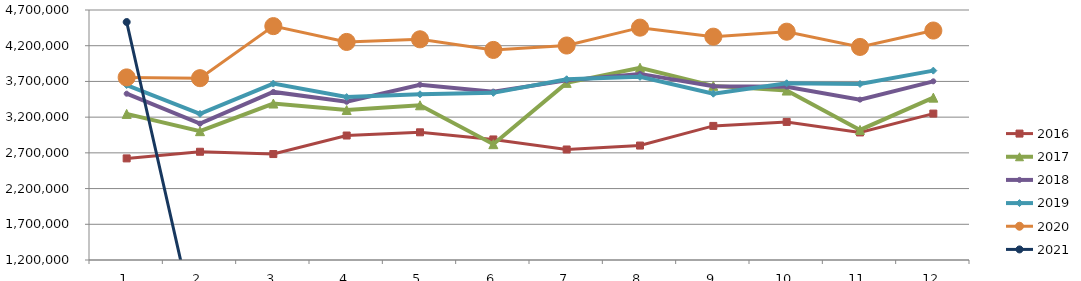
| Category | 2015 | 2016 | 2017 | 2018 | 2019 | 2020 | 2021 |
|---|---|---|---|---|---|---|---|
| 0 |  | 2622357.223 | 3245197.198 | 3528241.229 | 3649683.28 | 3756283.089 | 4531541.153 |
| 1 |  | 2715310.977 | 3003729.629 | 3108555.552 | 3245578.859 | 3745626.569 | 0 |
| 2 |  | 2683334.081 | 3390554.233 | 3553184.371 | 3669368.201 | 4474226.706 | 0 |
| 3 |  | 2942696.513 | 3299613.683 | 3414889.226 | 3480737.518 | 4252877.011 | 0 |
| 4 |  | 2987632.117 | 3365963.719 | 3653293.789 | 3520173.393 | 4289935.067 | 0 |
| 5 |  | 2887718.315 | 2821580.781 | 3557351.211 | 3540194.304 | 4141054.684 | 0 |
| 6 |  | 2747166.698 | 3679918.411 | 3714873.235 | 3730287.221 | 4202654.044 | 0 |
| 7 |  | 2802126.518 | 3891741.582 | 3805404.89 | 3764065.715 | 4452839.823 | 0 |
| 8 |  | 3077154.853 | 3637785.062 | 3633589.924 | 3528193.213 | 4326562.065 | 0 |
| 9 |  | 3132986.26 | 3572314.256 | 3626810.501 | 3674095.651 | 4396335.731 | 0 |
| 10 |  | 2985784.845 | 3021243.296 | 3445044.438 | 3664597.161 | 4182792.836 | 0 |
| 11 |  | 3249878.984 | 3473156.754 | 3701418.855 | 3851208.606 | 4412374.456 | 0 |